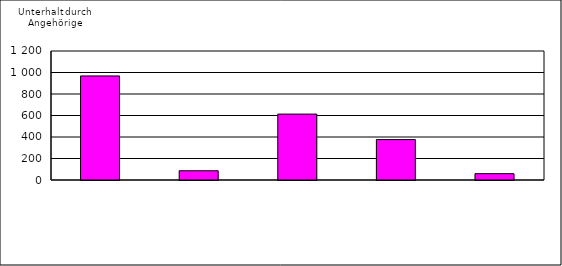
| Category | Series 0 |
|---|---|
| 0 | 968 |
| 1 | 86 |
| 2 | 613 |
| 3 | 376 |
| 4 | 59 |